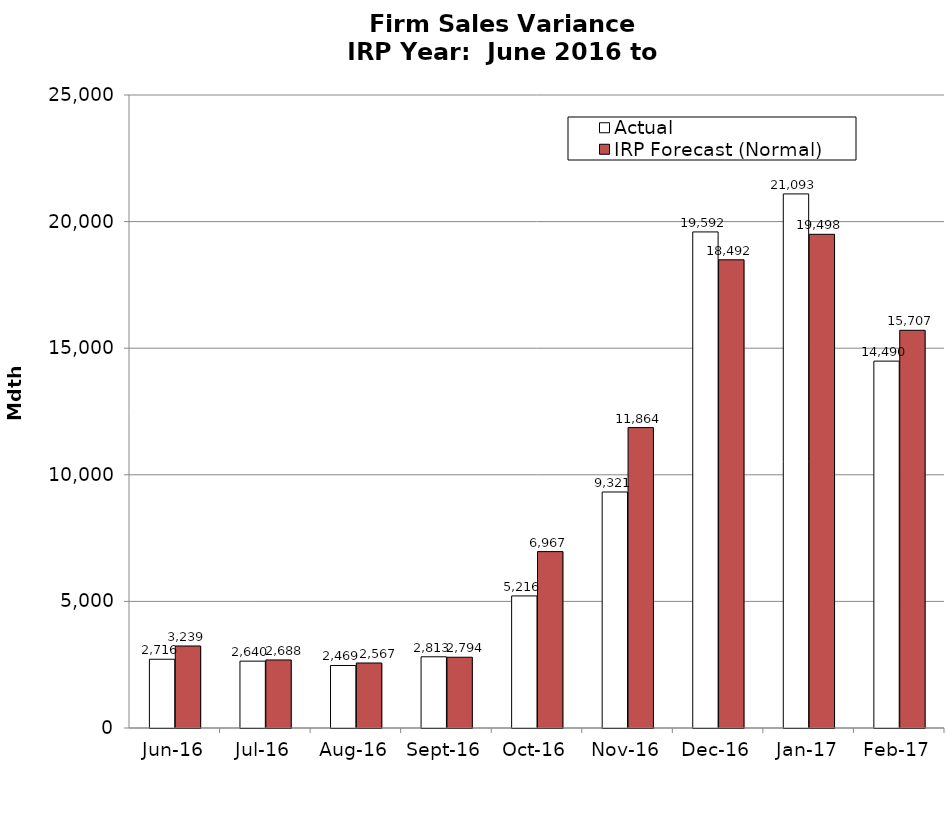
| Category | Actual | IRP Forecast (Normal) |
|---|---|---|
| 2016-06-01 | 2715.814 | 3238.888 |
| 2016-07-01 | 2640.317 | 2688.037 |
| 2016-08-01 | 2468.985 | 2567.446 |
| 2016-09-01 | 2812.647 | 2794.366 |
| 2016-10-01 | 5215.98 | 6967.024 |
| 2016-11-01 | 9320.981 | 11863.885 |
| 2016-12-01 | 19592.128 | 18491.824 |
| 2017-01-01 | 21093.477 | 19498.209 |
| 2017-02-01 | 14489.743 | 15706.513 |